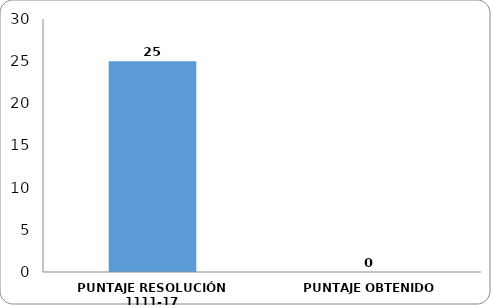
| Category | I. PLANEAR |
|---|---|
| PUNTAJE RESOLUCIÓN 1111-17 | 25 |
| PUNTAJE OBTENIDO | 0 |